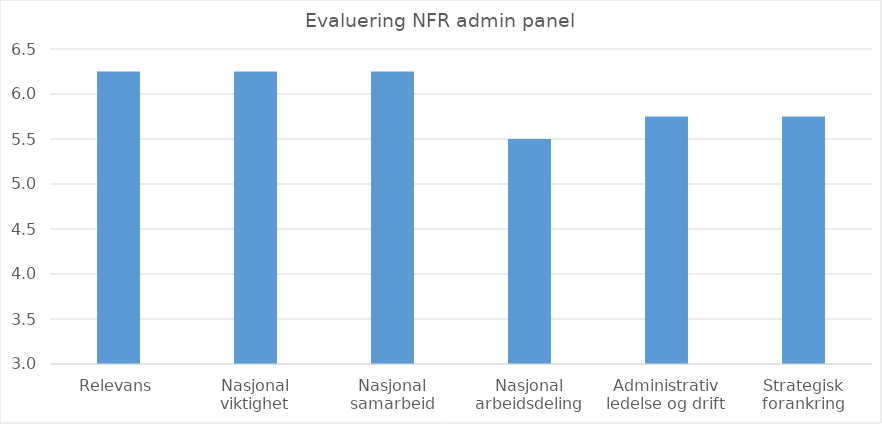
| Category | Series 0 |
|---|---|
| Relevans | 6.25 |
| Nasjonal viktighet | 6.25 |
| Nasjonal samarbeid | 6.25 |
| Nasjonal arbeidsdeling | 5.5 |
| Administrativ ledelse og drift | 5.75 |
| Strategisk forankring | 5.75 |